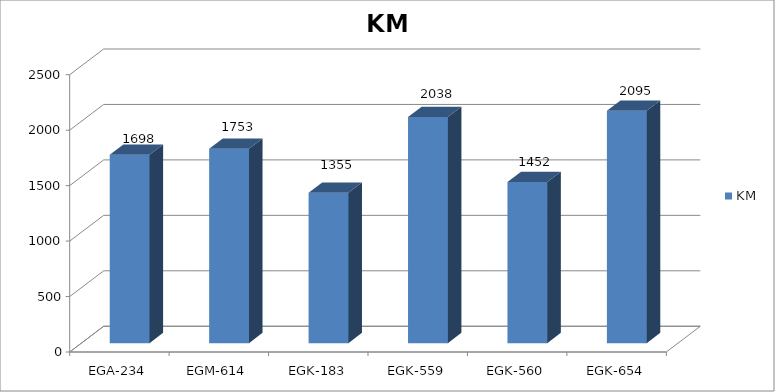
| Category | KM |
|---|---|
| EGA-234 | 1698 |
| EGM-614 | 1753 |
| EGK-183 | 1355 |
| EGK-559 | 2038 |
| EGK-560 | 1452 |
| EGK-654 | 2095 |